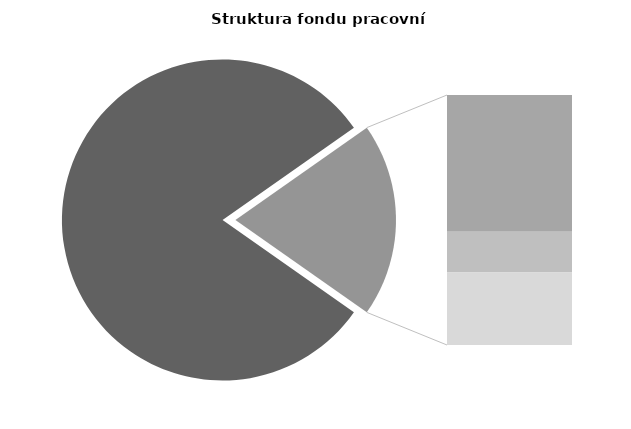
| Category | Series 0 |
|---|---|
| Průměrná měsíční 
odpracovaná doba  
bez přesčasu | 138.626 |
| Dovolená | 18.382 |
| Nemoc | 5.458 |
| Jiné | 9.759 |